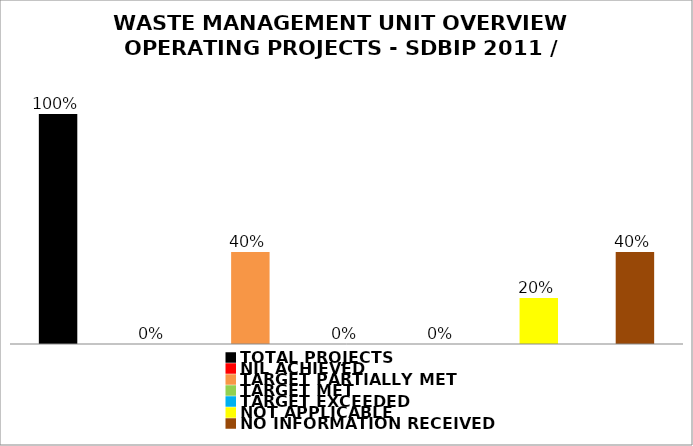
| Category | Series 0 |
|---|---|
| TOTAL PROJECTS | 1 |
| NIL ACHIEVED | 0 |
| TARGET PARTIALLY MET | 0.4 |
| TARGET MET | 0 |
| TARGET EXCEEDED | 0 |
| NOT APPLICABLE | 0.2 |
| NO INFORMATION RECEIVED | 0.4 |